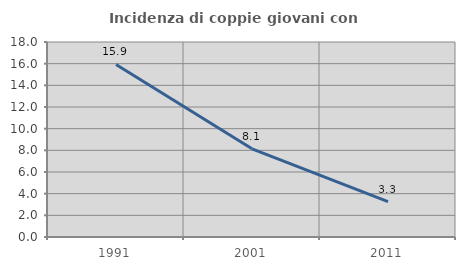
| Category | Incidenza di coppie giovani con figli |
|---|---|
| 1991.0 | 15.926 |
| 2001.0 | 8.142 |
| 2011.0 | 3.261 |